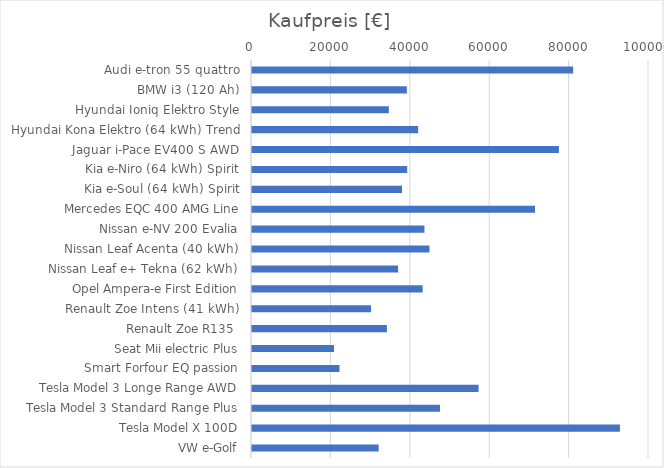
| Category | Series 0 |
|---|---|
| Audi e-tron 55 quattro | 80900 |
| BMW i3 (120 Ah) | 39000 |
| Hyundai Ioniq Elektro Style | 34459 |
| Hyundai Kona Elektro (64 kWh) Trend | 41850 |
| Jaguar i-Pace EV400 S AWD | 77300 |
| Kia e-Niro (64 kWh) Spirit | 39090 |
| Kia e-Soul (64 kWh) Spirit | 37790 |
| Mercedes EQC 400 AMG Line | 71281 |
| Nissan e-NV 200 Evalia | 43433 |
| Nissan Leaf Acenta (40 kWh) | 44700 |
| Nissan Leaf e+ Tekna (62 kWh) | 36800 |
| Opel Ampera-e First Edition | 42990 |
| Renault Zoe Intens (41 kWh) | 29990 |
| Renault Zoe R135  | 33990 |
| Seat Mii electric Plus | 20650 |
| Smart Forfour EQ passion | 22030 |
| Tesla Model 3 Longe Range AWD | 57070 |
| Tesla Model 3 Standard Range Plus | 47370 |
| Tesla Model X 100D | 92680 |
| VW e-Golf | 31900 |